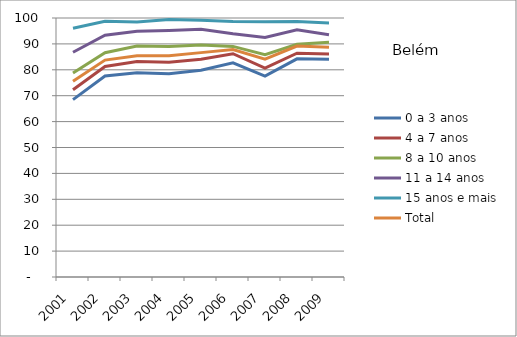
| Category | 0 a 3 anos | 4 a 7 anos | 8 a 10 anos | 11 a 14 anos | 15 anos e mais | Total |
|---|---|---|---|---|---|---|
| 2001.0 | 68.49 | 72.29 | 78.74 | 86.79 | 96.05 | 75.54 |
| 2002.0 | 77.59 | 81.26 | 86.58 | 93.35 | 98.71 | 83.75 |
| 2003.0 | 78.85 | 83.23 | 89.22 | 94.84 | 98.41 | 85.39 |
| 2004.0 | 78.46 | 82.88 | 88.95 | 95.15 | 99.41 | 85.44 |
| 2005.0 | 79.81 | 84.07 | 89.57 | 95.62 | 99.11 | 86.63 |
| 2006.0 | 82.68 | 86.21 | 89.04 | 93.88 | 98.67 | 87.81 |
| 2007.0 | 77.6 | 80.69 | 85.8 | 92.46 | 98.56 | 84.14 |
| 2008.0 | 84.23 | 86.43 | 89.87 | 95.44 | 98.62 | 89.17 |
| 2009.0 | 84.07 | 86.09 | 90.64 | 93.56 | 98.06 | 88.73 |